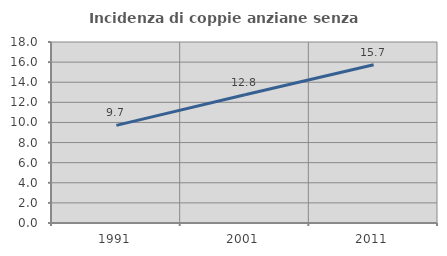
| Category | Incidenza di coppie anziane senza figli  |
|---|---|
| 1991.0 | 9.705 |
| 2001.0 | 12.756 |
| 2011.0 | 15.745 |